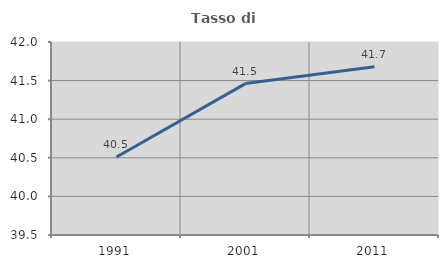
| Category | Tasso di occupazione   |
|---|---|
| 1991.0 | 40.509 |
| 2001.0 | 41.461 |
| 2011.0 | 41.68 |